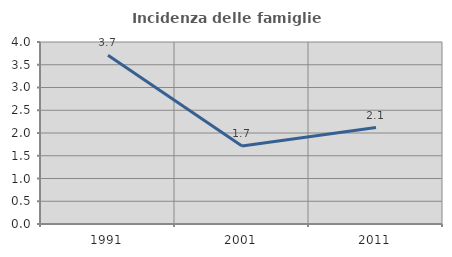
| Category | Incidenza delle famiglie numerose |
|---|---|
| 1991.0 | 3.707 |
| 2001.0 | 1.714 |
| 2011.0 | 2.119 |